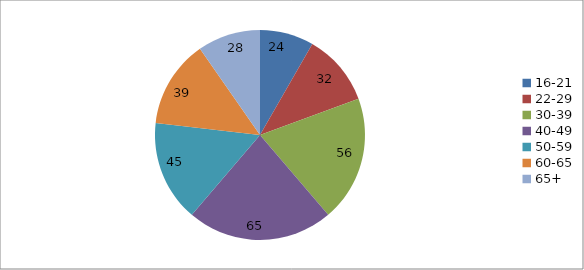
| Category | Series 0 |
|---|---|
| 16-21 | 24 |
| 22-29 | 32 |
| 30-39 | 56 |
| 40-49 | 65 |
| 50-59 | 45 |
| 60-65 | 39 |
| 65+ | 28 |